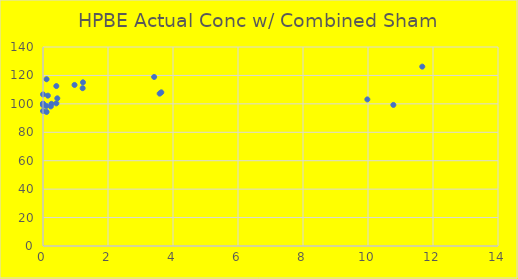
| Category | HPBE Actual Conc w/ Combined Sham |
|---|---|
| 11.67 | 126.197 |
| 3.42 | 118.926 |
| 0.97 | 113.318 |
| 0.41 | 112.522 |
| 0.15 | 105.785 |
| 0.11 | 117.318 |
| 0.0 | 100 |
| 0.0 | 106.658 |
| 9.98 | 103.128 |
| 3.59 | 107.208 |
| 1.23 | 115.14 |
| 0.44 | 103.886 |
| 0.24 | 98.22 |
| 0.1 | 98.518 |
| 0.0 | 100 |
| 0.0 | 94.965 |
| 10.78 | 99.262 |
| 3.64 | 108.11 |
| 1.22 | 111.025 |
| 0.41 | 100.337 |
| 0.26 | 100.004 |
| 0.11 | 94.303 |
| 0.0 | 100 |
| 0.0 | 99.161 |